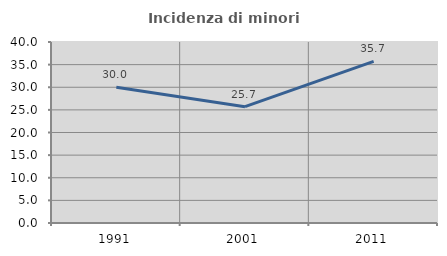
| Category | Incidenza di minori stranieri |
|---|---|
| 1991.0 | 30 |
| 2001.0 | 25.714 |
| 2011.0 | 35.714 |